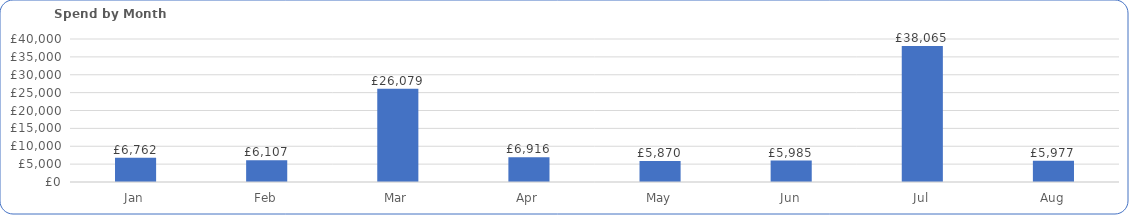
| Category | Total |
|---|---|
| Jan | 6762.3 |
| Feb | 6107.42 |
| Mar | 26078.9 |
| Apr | 6916.36 |
| May | 5869.54 |
| Jun | 5984.97 |
| Jul | 38064.65 |
| Aug | 5977.06 |